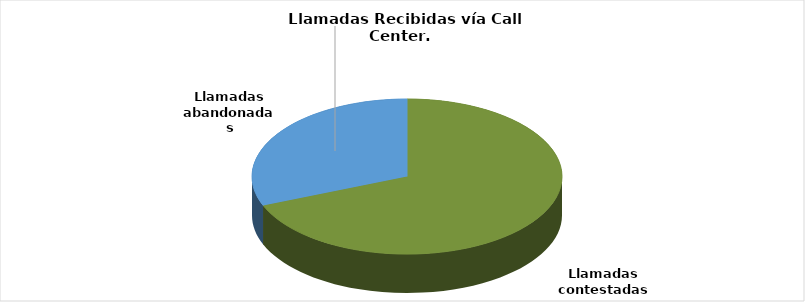
| Category | Enero-Diciembre |
|---|---|
| Llamadas contestadas | 182889 |
| Llamadas abandonadas | 82534 |